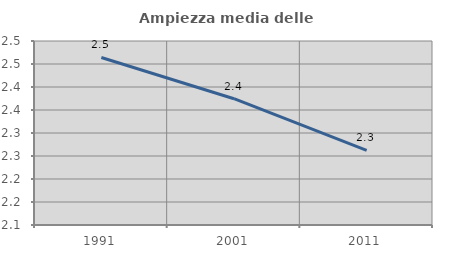
| Category | Ampiezza media delle famiglie |
|---|---|
| 1991.0 | 2.464 |
| 2001.0 | 2.375 |
| 2011.0 | 2.262 |